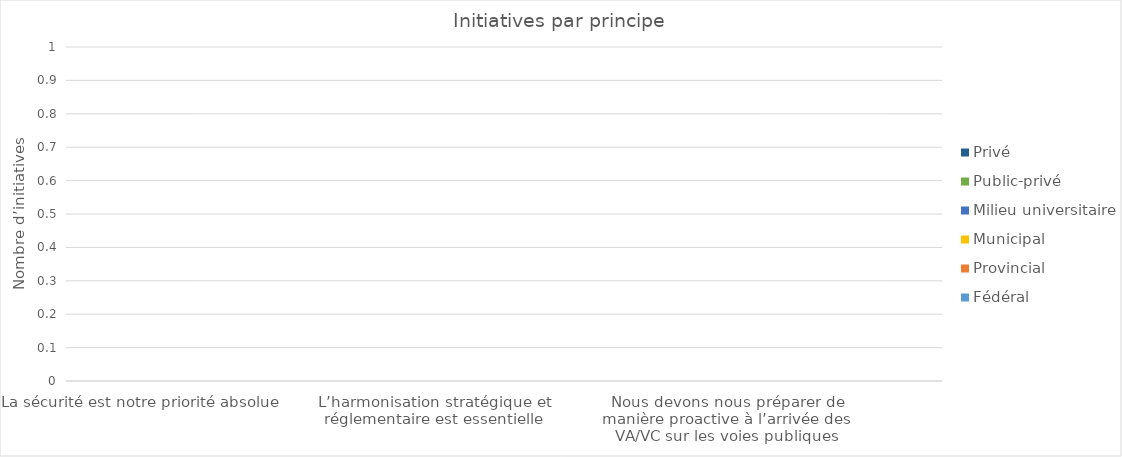
| Category | Fédéral | Provincial | Municipal | Milieu universitaire | Public-privé | Privé |
|---|---|---|---|---|---|---|
| La sécurité est notre priorité absolue | 0 | 0 | 0 | 0 | 0 | 0 |
| Nous devons échanger des renseignements pour nous assurer que les VA/VC sont sécuritaires et sûrs | 0 | 0 | 0 | 0 | 0 | 0 |
| L’harmonisation stratégique et réglementaire est essentielle | 0 | 0 | 0 | 0 | 0 | 0 |
| Nous devons sensibiliser le public aux capacités et aux limites des VA/VC | 0 | 0 | 0 | 0 | 0 | 0 |
| Nous devons nous préparer de manière proactive à l’arrivée des VA/VC sur les voies publiques | 0 | 0 | 0 | 0 | 0 | 0 |
| Une collaboration continue est essentielle | 0 | 0 | 0 | 0 | 0 | 0 |